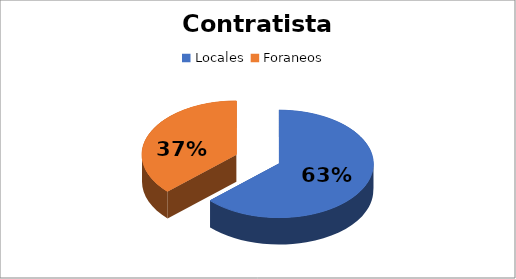
| Category | Suma |
|---|---|
| Locales  | 68089311.18 |
| Foraneos  | 39994937.15 |